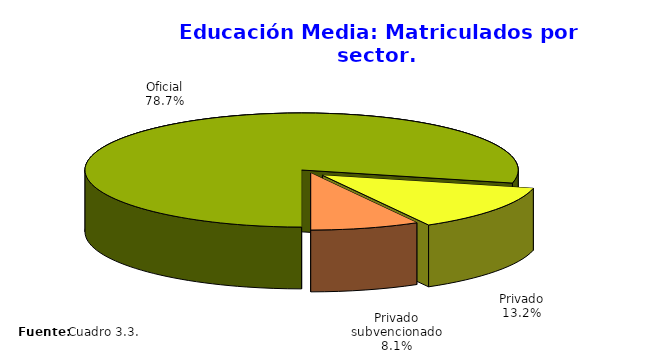
| Category | Series 0 |
|---|---|
| Oficial | 194974 |
| Privado | 32663 |
| Privado subvencionado | 20195 |